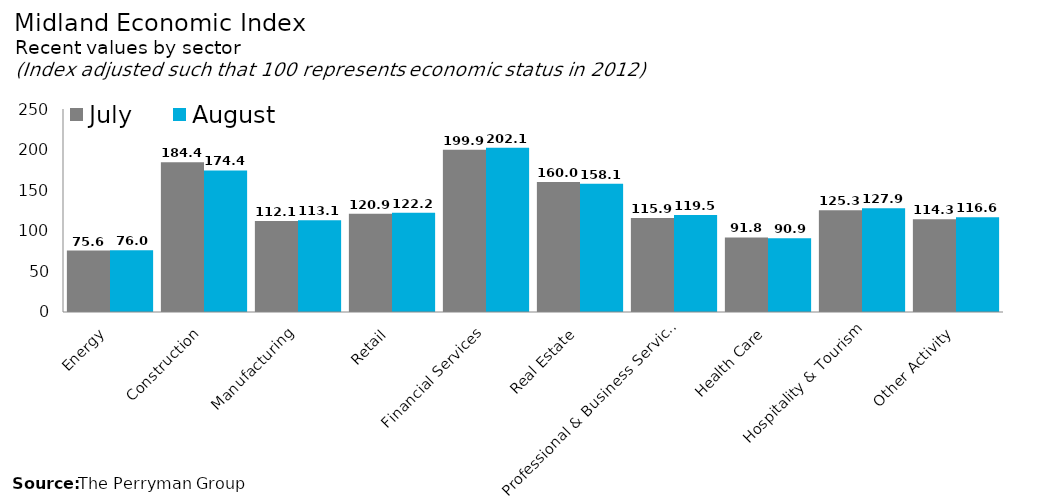
| Category | July | August |
|---|---|---|
| Energy | 75.593 | 75.962 |
| Construction | 184.352 | 174.399 |
| Manufacturing | 112.056 | 113.098 |
| Retail | 120.861 | 122.211 |
| Financial Services | 199.941 | 202.145 |
| Real Estate | 160.042 | 158.079 |
| Professional & Business Services | 115.871 | 119.531 |
| Health Care | 91.768 | 90.882 |
| Hospitality & Tourism | 125.273 | 127.87 |
| Other Activity | 114.277 | 116.639 |